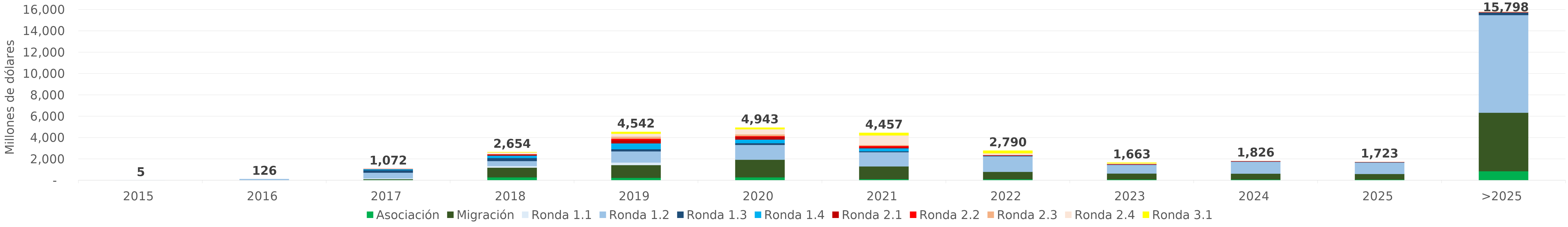
| Category | Asociación | Migración | Ronda 1.1 | Ronda 1.2 | Ronda 1.3 | Ronda 1.4 | Ronda 2.1 | Ronda 2.2 | Ronda 2.3 | Ronda 2.4 | Ronda 3.1 |
|---|---|---|---|---|---|---|---|---|---|---|---|
| 2015 | 0 | 0 | 4.573 | 0.236 | 0 | 0 | 0 | 0 | 0 | 0 | 0 |
| 2016 | 0 | 0 | 16.79 | 108.909 | 0 | 0 | 0 | 0 | 0 | 0 | 0 |
| 2017 | 50.877 | 65.422 | 76.429 | 533.486 | 231.789 | 93.443 | 18.851 | 1.29 | 0.72 | 0 | 0 |
| 2018 | 289.394 | 902.921 | 155.042 | 470.128 | 278.302 | 226.903 | 104.896 | 21.902 | 26.974 | 139.641 | 37.691 |
| 2019 | 241.207 | 1195.818 | 236.68 | 1049.68 | 207.126 | 540.649 | 302.09 | 133.009 | 199.161 | 270.262 | 166.186 |
| 2020 | 284.321 | 1655.641 | 6.736 | 1382.287 | 161.213 | 341.057 | 252.645 | 70.216 | 163.112 | 477.469 | 148.013 |
| 2021 | 118.804 | 1192.243 | 2.229 | 1327.977 | 92.463 | 274.593 | 106.762 | 117.22 | 82.417 | 902.96 | 238.989 |
| 2022 | 112.591 | 689.457 | 0 | 1456.781 | 44.141 | 10.69 | 22.691 | 31.916 | 29.171 | 142.246 | 250.81 |
| 2023 | 87.085 | 555.219 | 0 | 811.608 | 38.135 | 0.73 | 0.019 | 37.005 | 21.555 | 47.441 | 63.845 |
| 2024 | 79.455 | 553.791 | 0 | 1115.867 | 33.996 | 0 | 0 | 27.408 | 14.136 | 1.529 | 0 |
| 2025 | 75.288 | 530.69 | 0 | 1062.934 | 35.345 | 0 | 0 | 10.138 | 8.511 | 0 | 0 |
| >2025 | 859.226 | 5485.433 | 0 | 9144.06 | 249.076 | 0 | 0 | 24.866 | 34.959 | 0 | 0 |